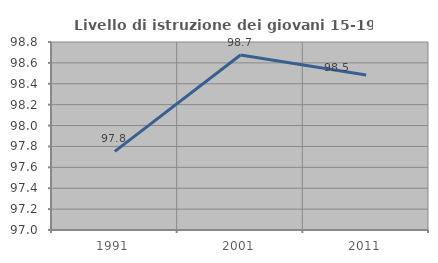
| Category | Livello di istruzione dei giovani 15-19 anni |
|---|---|
| 1991.0 | 97.753 |
| 2001.0 | 98.675 |
| 2011.0 | 98.485 |